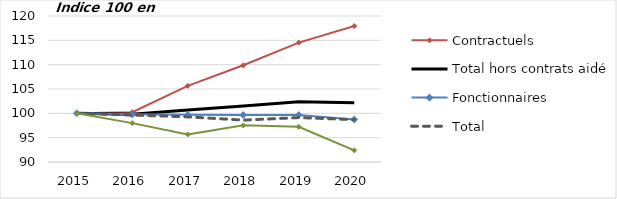
| Category | Contractuels | Total hors contrats aidés | Fonctionnaires | Total  | Autres, hors contrats aidés |
|---|---|---|---|---|---|
| 2015.0 | 100 | 100 | 100 | 100 | 100 |
| 2016.0 | 100.229 | 99.816 | 99.791 | 99.645 | 97.986 |
| 2017.0 | 105.657 | 100.684 | 99.69 | 99.283 | 95.675 |
| 2018.0 | 109.87 | 101.513 | 99.66 | 98.604 | 97.53 |
| 2019.0 | 114.532 | 102.386 | 99.666 | 99.129 | 97.232 |
| 2020.0 | 117.94 | 102.154 | 98.745 | 98.706 | 92.392 |